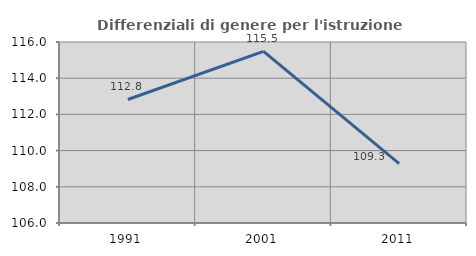
| Category | Differenziali di genere per l'istruzione superiore |
|---|---|
| 1991.0 | 112.824 |
| 2001.0 | 115.486 |
| 2011.0 | 109.279 |